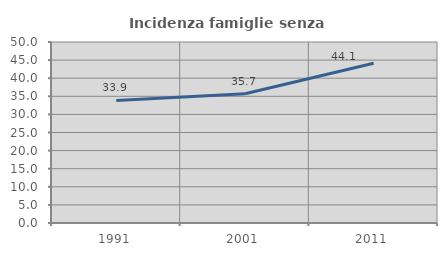
| Category | Incidenza famiglie senza nuclei |
|---|---|
| 1991.0 | 33.86 |
| 2001.0 | 35.689 |
| 2011.0 | 44.121 |